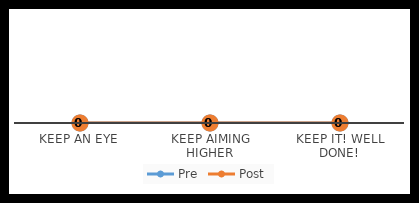
| Category | Pre | Post |
|---|---|---|
| Keep An Eye | 0 | 0 |
| Keep Aiming Higher | 0 | 0 |
| Keep it! Well done! | 0 | 0 |